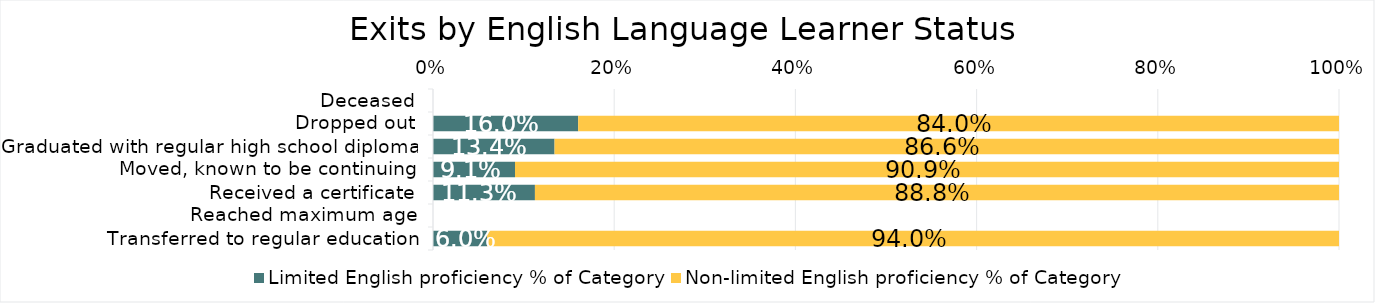
| Category | Limited English proficiency % of Category | Non-limited English proficiency % of Category |
|---|---|---|
| Deceased | 0 | 0 |
| Dropped out | 0.16 | 0.84 |
| Graduated with regular high school diploma | 0.134 | 0.866 |
| Moved, known to be continuing | 0.091 | 0.909 |
| Received a certificate | 0.112 | 0.888 |
| Reached maximum age | 0 | 0 |
| Transferred to regular education | 0.06 | 0.94 |